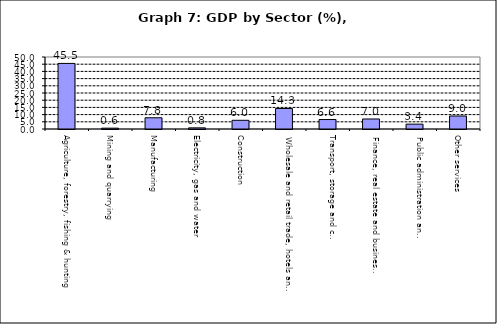
| Category | Series 0 |
|---|---|
| Agriculture, forestry, fishing & hunting | 45.543 |
| Mining and quarrying  | 0.585 |
| Manufacturing | 7.81 |
| Electricity, gas and water | 0.796 |
| Construction | 6.037 |
| Wholesale and retail trade, hotels and restaurants  | 14.257 |
| Transport, storage and communication                | 6.576 |
| Finance, real estate and business services          | 6.965 |
| Public administration and Defense                       | 3.373 |
| Other services                                    | 9.027 |